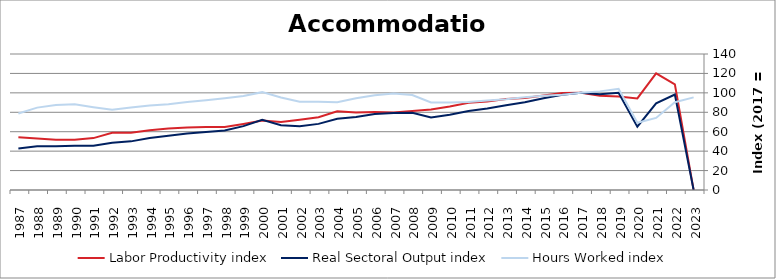
| Category | Labor Productivity index | Real Sectoral Output index | Hours Worked index |
|---|---|---|---|
| 2023.0 | 0 | 0 | 95.347 |
| 2022.0 | 108.802 | 98.325 | 90.371 |
| 2021.0 | 120.065 | 89.119 | 74.226 |
| 2020.0 | 94.222 | 65.171 | 69.168 |
| 2019.0 | 96.239 | 100.182 | 104.097 |
| 2018.0 | 96.961 | 98.442 | 101.528 |
| 2017.0 | 100 | 100 | 100 |
| 2016.0 | 99.815 | 97.945 | 98.126 |
| 2015.0 | 97.382 | 94.366 | 96.903 |
| 2014.0 | 94.631 | 90.352 | 95.479 |
| 2013.0 | 93.56 | 87.289 | 93.298 |
| 2012.0 | 91.066 | 83.913 | 92.146 |
| 2011.0 | 89.761 | 81.286 | 90.558 |
| 2010.0 | 85.894 | 77.421 | 90.136 |
| 2009.0 | 82.905 | 74.741 | 90.152 |
| 2008.0 | 81.312 | 79.538 | 97.819 |
| 2007.0 | 79.867 | 79.348 | 99.351 |
| 2006.0 | 80.229 | 78.163 | 97.424 |
| 2005.0 | 79.658 | 75.226 | 94.437 |
| 2004.0 | 81.075 | 73.25 | 90.348 |
| 2003.0 | 74.982 | 68.06 | 90.768 |
| 2002.0 | 72.27 | 65.734 | 90.957 |
| 2001.0 | 69.978 | 66.63 | 95.216 |
| 2000.0 | 71.65 | 72.169 | 100.725 |
| 1999.0 | 68.046 | 65.774 | 96.662 |
| 1998.0 | 64.773 | 61.249 | 94.558 |
| 1997.0 | 64.727 | 59.807 | 92.399 |
| 1996.0 | 64.421 | 58.279 | 90.465 |
| 1995.0 | 63.25 | 55.835 | 88.277 |
| 1994.0 | 61.505 | 53.461 | 86.921 |
| 1993.0 | 58.932 | 50.068 | 84.96 |
| 1992.0 | 58.878 | 48.673 | 82.668 |
| 1991.0 | 53.409 | 45.529 | 85.246 |
| 1990.0 | 51.735 | 45.649 | 88.235 |
| 1989.0 | 51.676 | 45.152 | 87.375 |
| 1988.0 | 53.077 | 45.013 | 84.807 |
| 1987.0 | 54.333 | 42.826 | 78.822 |